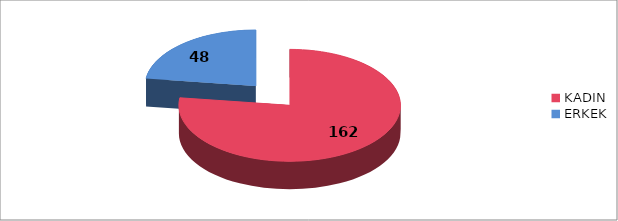
| Category | Series 0 |
|---|---|
| KADIN | 162 |
| ERKEK | 48 |